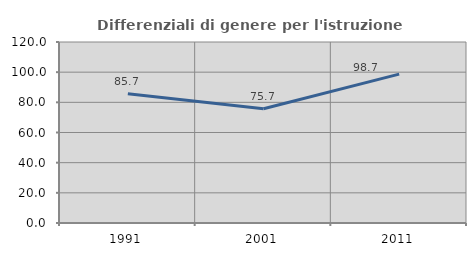
| Category | Differenziali di genere per l'istruzione superiore |
|---|---|
| 1991.0 | 85.697 |
| 2001.0 | 75.726 |
| 2011.0 | 98.695 |